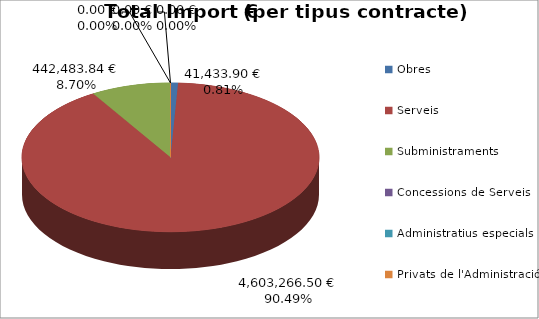
| Category | Total preu              (amb iva) |
|---|---|
| Obres | 41433.9 |
| Serveis | 4603266.5 |
| Subministraments | 442483.84 |
| Concessions de Serveis | 0 |
| Administratius especials | 0 |
| Privats de l'Administració | 0 |